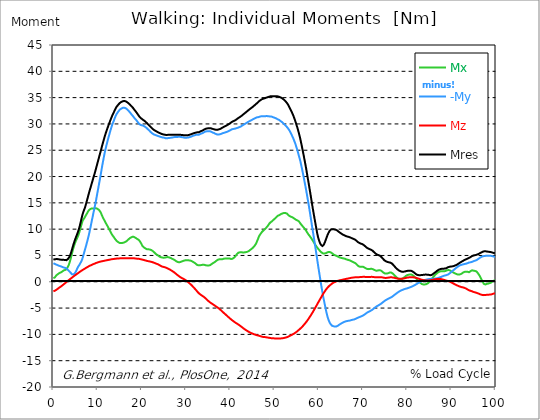
| Category |  Mx |  -My |  Mz |  Mres |
|---|---|---|---|---|
| 0.0 | 0.69 | 3.52 | -1.82 | 4.28 |
| 0.167348456675344 | 0.74 | 3.45 | -1.77 | 4.25 |
| 0.334696913350688 | 0.83 | 3.4 | -1.7 | 4.25 |
| 0.5020453700260321 | 1.01 | 3.33 | -1.62 | 4.29 |
| 0.669393826701376 | 1.22 | 3.26 | -1.53 | 4.33 |
| 0.83674228337672 | 1.31 | 3.19 | -1.44 | 4.3 |
| 1.0040907400520642 | 1.44 | 3.14 | -1.33 | 4.3 |
| 1.1621420602454444 | 1.55 | 3.08 | -1.22 | 4.29 |
| 1.3294905169207885 | 1.64 | 3.03 | -1.11 | 4.25 |
| 1.4968389735961325 | 1.71 | 2.99 | -1.01 | 4.23 |
| 1.6641874302714765 | 1.77 | 2.94 | -0.92 | 4.2 |
| 1.8315358869468206 | 1.83 | 2.88 | -0.82 | 4.17 |
| 1.9988843436221646 | 1.94 | 2.82 | -0.71 | 4.16 |
| 2.1662328002975086 | 2.04 | 2.77 | -0.61 | 4.17 |
| 2.333581256972853 | 2.15 | 2.71 | -0.49 | 4.17 |
| 2.5009297136481967 | 2.23 | 2.67 | -0.36 | 4.17 |
| 2.6682781703235405 | 2.24 | 2.64 | -0.25 | 4.13 |
| 2.8356266269988843 | 2.23 | 2.59 | -0.13 | 4.08 |
| 3.002975083674229 | 2.39 | 2.5 | -0.02 | 4.11 |
| 3.1703235403495724 | 2.66 | 2.38 | 0.09 | 4.26 |
| 3.337671997024917 | 2.92 | 2.23 | 0.22 | 4.36 |
| 3.4957233172182973 | 3.24 | 2.08 | 0.34 | 4.51 |
| 3.663071773893641 | 3.66 | 1.93 | 0.44 | 4.78 |
| 3.8304202305689854 | 4.14 | 1.8 | 0.55 | 5.12 |
| 3.997768687244329 | 4.67 | 1.63 | 0.65 | 5.55 |
| 4.165117143919673 | 5.23 | 1.43 | 0.75 | 5.99 |
| 4.332465600595017 | 5.81 | 1.39 | 0.87 | 6.5 |
| 4.499814057270361 | 6.34 | 1.39 | 0.98 | 6.97 |
| 4.667162513945706 | 6.77 | 1.49 | 1.09 | 7.39 |
| 4.834510970621049 | 7.22 | 1.59 | 1.18 | 7.83 |
| 5.001859427296393 | 7.6 | 1.82 | 1.29 | 8.23 |
| 5.169207883971737 | 7.93 | 2.08 | 1.39 | 8.6 |
| 5.336556340647081 | 8.21 | 2.39 | 1.49 | 8.95 |
| 5.503904797322425 | 8.55 | 2.69 | 1.59 | 9.33 |
| 5.671253253997769 | 8.9 | 2.95 | 1.69 | 9.73 |
| 5.82930457419115 | 9.32 | 3.15 | 1.79 | 10.19 |
| 5.996653030866494 | 9.78 | 3.38 | 1.9 | 10.71 |
| 6.164001487541838 | 10.28 | 3.64 | 2 | 11.3 |
| 6.331349944217181 | 10.8 | 3.9 | 2.1 | 11.89 |
| 6.498698400892526 | 11.3 | 4.23 | 2.18 | 12.48 |
| 6.66604685756787 | 11.68 | 4.66 | 2.27 | 12.99 |
| 6.833395314243213 | 11.9 | 5.17 | 2.36 | 13.41 |
| 7.000743770918558 | 12.1 | 5.67 | 2.44 | 13.78 |
| 7.168092227593902 | 12.28 | 6.17 | 2.52 | 14.14 |
| 7.335440684269246 | 12.6 | 6.65 | 2.61 | 14.65 |
| 7.50278914094459 | 12.85 | 7.17 | 2.69 | 15.15 |
| 7.6701375976199335 | 13.07 | 7.71 | 2.78 | 15.66 |
| 7.837486054295278 | 13.34 | 8.26 | 2.86 | 16.2 |
| 7.995537374488658 | 13.57 | 8.83 | 2.94 | 16.72 |
| 8.162885831164003 | 13.73 | 9.45 | 3.01 | 17.22 |
| 8.330234287839346 | 13.81 | 10.11 | 3.08 | 17.7 |
| 8.49758274451469 | 13.88 | 10.79 | 3.14 | 18.17 |
| 8.664931201190035 | 13.94 | 11.49 | 3.21 | 18.66 |
| 8.832279657865378 | 13.94 | 12.17 | 3.28 | 19.14 |
| 8.999628114540721 | 13.91 | 12.87 | 3.34 | 19.63 |
| 9.166976571216066 | 13.96 | 13.51 | 3.4 | 20.12 |
| 9.334325027891412 | 13.96 | 14.15 | 3.45 | 20.57 |
| 9.501673484566755 | 13.98 | 14.84 | 3.51 | 21.08 |
| 9.669021941242098 | 13.97 | 15.56 | 3.57 | 21.6 |
| 9.836370397917442 | 13.9 | 16.34 | 3.62 | 22.13 |
| 10.003718854592787 | 13.85 | 17.1 | 3.67 | 22.66 |
| 10.17106731126813 | 13.74 | 17.85 | 3.72 | 23.16 |
| 10.329118631461512 | 13.63 | 18.63 | 3.76 | 23.69 |
| 10.496467088136853 | 13.46 | 19.4 | 3.8 | 24.21 |
| 10.663815544812199 | 13.24 | 20.17 | 3.84 | 24.72 |
| 10.831164001487544 | 12.93 | 20.99 | 3.87 | 25.24 |
| 10.998512458162887 | 12.58 | 21.83 | 3.9 | 25.77 |
| 11.16586091483823 | 12.28 | 22.59 | 3.92 | 26.29 |
| 11.333209371513574 | 12 | 23.34 | 3.96 | 26.79 |
| 11.50055782818892 | 11.73 | 24.06 | 3.99 | 27.28 |
| 11.667906284864264 | 11.45 | 24.75 | 4.02 | 27.77 |
| 11.835254741539607 | 11.19 | 25.38 | 4.05 | 28.22 |
| 12.00260319821495 | 10.94 | 25.95 | 4.08 | 28.63 |
| 12.169951654890292 | 10.7 | 26.49 | 4.1 | 29.03 |
| 12.337300111565641 | 10.44 | 27.03 | 4.13 | 29.43 |
| 12.504648568240984 | 10.17 | 27.54 | 4.17 | 29.82 |
| 12.662699888434362 | 9.9 | 28.04 | 4.19 | 30.19 |
| 12.830048345109708 | 9.63 | 28.54 | 4.22 | 30.57 |
| 12.997396801785053 | 9.36 | 29.02 | 4.25 | 30.93 |
| 13.164745258460396 | 9.11 | 29.47 | 4.28 | 31.28 |
| 13.33209371513574 | 8.86 | 29.91 | 4.3 | 31.64 |
| 13.499442171811083 | 8.68 | 30.26 | 4.32 | 31.93 |
| 13.666790628486426 | 8.5 | 30.6 | 4.34 | 32.21 |
| 13.834139085161771 | 8.28 | 30.99 | 4.35 | 32.52 |
| 14.001487541837117 | 8.08 | 31.35 | 4.37 | 32.82 |
| 14.16883599851246 | 7.9 | 31.67 | 4.39 | 33.08 |
| 14.336184455187803 | 7.75 | 31.93 | 4.41 | 33.3 |
| 14.503532911863147 | 7.63 | 32.14 | 4.42 | 33.48 |
| 14.670881368538492 | 7.53 | 32.34 | 4.43 | 33.65 |
| 14.828932688731873 | 7.44 | 32.53 | 4.44 | 33.81 |
| 14.996281145407215 | 7.38 | 32.69 | 4.45 | 33.96 |
| 15.163629602082558 | 7.36 | 32.82 | 4.46 | 34.07 |
| 15.330978058757903 | 7.37 | 32.91 | 4.46 | 34.17 |
| 15.498326515433247 | 7.37 | 32.99 | 4.47 | 34.24 |
| 15.665674972108594 | 7.39 | 33.05 | 4.47 | 34.3 |
| 15.833023428783937 | 7.42 | 33.08 | 4.48 | 34.35 |
| 16.00037188545928 | 7.47 | 33.08 | 4.48 | 34.36 |
| 16.167720342134626 | 7.53 | 33.04 | 4.48 | 34.33 |
| 16.335068798809967 | 7.6 | 33 | 4.48 | 34.3 |
| 16.502417255485312 | 7.69 | 32.91 | 4.47 | 34.24 |
| 16.669765712160658 | 7.81 | 32.79 | 4.47 | 34.14 |
| 16.837114168836 | 7.94 | 32.65 | 4.48 | 34.04 |
| 17.004462625511344 | 8.07 | 32.5 | 4.48 | 33.92 |
| 17.16251394570472 | 8.19 | 32.36 | 4.48 | 33.81 |
| 17.32986240238007 | 8.32 | 32.17 | 4.48 | 33.66 |
| 17.497210859055414 | 8.4 | 31.99 | 4.48 | 33.5 |
| 17.664559315730756 | 8.47 | 31.81 | 4.48 | 33.35 |
| 17.8319077724061 | 8.55 | 31.64 | 4.47 | 33.2 |
| 17.999256229081443 | 8.58 | 31.48 | 4.47 | 33.06 |
| 18.166604685756788 | 8.53 | 31.3 | 4.46 | 32.88 |
| 18.333953142432133 | 8.48 | 31.1 | 4.45 | 32.67 |
| 18.501301599107478 | 8.38 | 30.94 | 4.43 | 32.48 |
| 18.668650055782823 | 8.3 | 30.81 | 4.41 | 32.33 |
| 18.835998512458165 | 8.21 | 30.62 | 4.4 | 32.13 |
| 19.00334696913351 | 8.11 | 30.44 | 4.38 | 31.92 |
| 19.170695425808855 | 8.03 | 30.25 | 4.37 | 31.72 |
| 19.338043882484197 | 7.94 | 30.07 | 4.36 | 31.53 |
| 19.496095202677576 | 7.77 | 29.92 | 4.33 | 31.34 |
| 19.66344365935292 | 7.55 | 29.82 | 4.3 | 31.19 |
| 19.830792116028263 | 7.32 | 29.78 | 4.27 | 31.07 |
| 19.998140572703612 | 7.03 | 29.74 | 4.23 | 30.94 |
| 20.165489029378953 | 6.77 | 29.71 | 4.21 | 30.84 |
| 20.3328374860543 | 6.62 | 29.67 | 4.17 | 30.76 |
| 20.500185942729644 | 6.52 | 29.59 | 4.13 | 30.65 |
| 20.667534399404985 | 6.42 | 29.5 | 4.08 | 30.54 |
| 20.83488285608033 | 6.32 | 29.39 | 4.04 | 30.41 |
| 21.002231312755672 | 6.23 | 29.29 | 4.01 | 30.28 |
| 21.16957976943102 | 6.17 | 29.17 | 3.96 | 30.15 |
| 21.336928226106362 | 6.16 | 29.02 | 3.93 | 30.01 |
| 21.504276682781704 | 6.17 | 28.87 | 3.91 | 29.86 |
| 21.67162513945705 | 6.14 | 28.76 | 3.89 | 29.74 |
| 21.82967645965043 | 6.12 | 28.6 | 3.86 | 29.58 |
| 21.997024916325774 | 6.08 | 28.46 | 3.81 | 29.43 |
| 22.16437337300112 | 6.02 | 28.32 | 3.77 | 29.28 |
| 22.33172182967646 | 5.95 | 28.22 | 3.74 | 29.16 |
| 22.499070286351806 | 5.82 | 28.11 | 3.7 | 29.02 |
| 22.666418743027148 | 5.7 | 28.03 | 3.65 | 28.92 |
| 22.833767199702496 | 5.57 | 27.95 | 3.59 | 28.81 |
| 23.00111565637784 | 5.41 | 27.91 | 3.53 | 28.73 |
| 23.168464113053183 | 5.28 | 27.87 | 3.47 | 28.65 |
| 23.335812569728528 | 5.2 | 27.81 | 3.42 | 28.58 |
| 23.50316102640387 | 5.1 | 27.75 | 3.38 | 28.49 |
| 23.670509483079215 | 5 | 27.7 | 3.32 | 28.42 |
| 23.83785793975456 | 4.89 | 27.65 | 3.25 | 28.34 |
| 23.995909259947936 | 4.79 | 27.61 | 3.16 | 28.28 |
| 24.163257716623285 | 4.71 | 27.57 | 3.07 | 28.22 |
| 24.330606173298627 | 4.67 | 27.51 | 2.99 | 28.14 |
| 24.49795462997397 | 4.63 | 27.46 | 2.92 | 28.09 |
| 24.665303086649313 | 4.59 | 27.43 | 2.87 | 28.04 |
| 24.83265154332466 | 4.57 | 27.4 | 2.85 | 28.01 |
| 25.0 | 4.56 | 27.39 | 2.81 | 27.99 |
| 25.167348456675345 | 4.59 | 27.35 | 2.76 | 27.95 |
| 25.334696913350694 | 4.62 | 27.29 | 2.72 | 27.91 |
| 25.502045370026035 | 4.65 | 27.28 | 2.67 | 27.9 |
| 25.669393826701377 | 4.69 | 27.28 | 2.61 | 27.9 |
| 25.836742283376722 | 4.7 | 27.3 | 2.54 | 27.92 |
| 26.004090740052067 | 4.68 | 27.31 | 2.46 | 27.91 |
| 26.17143919672741 | 4.63 | 27.34 | 2.39 | 27.93 |
| 26.329490516920792 | 4.58 | 27.35 | 2.32 | 27.92 |
| 26.49683897359613 | 4.53 | 27.37 | 2.24 | 27.93 |
| 26.66418743027148 | 4.46 | 27.39 | 2.15 | 27.94 |
| 26.831535886946828 | 4.38 | 27.42 | 2.06 | 27.95 |
| 26.998884343622166 | 4.31 | 27.44 | 1.97 | 27.95 |
| 27.166232800297514 | 4.25 | 27.46 | 1.88 | 27.96 |
| 27.333581256972852 | 4.16 | 27.49 | 1.78 | 27.96 |
| 27.5009297136482 | 4.08 | 27.51 | 1.67 | 27.96 |
| 27.668278170323543 | 3.97 | 27.5 | 1.55 | 27.94 |
| 27.835626626998888 | 3.87 | 27.5 | 1.43 | 27.93 |
| 28.002975083674233 | 3.8 | 27.51 | 1.32 | 27.93 |
| 28.170323540349575 | 3.75 | 27.54 | 1.21 | 27.95 |
| 28.33767199702492 | 3.71 | 27.56 | 1.1 | 27.96 |
| 28.50502045370026 | 3.7 | 27.56 | 1 | 27.95 |
| 28.663071773893645 | 3.73 | 27.55 | 0.9 | 27.94 |
| 28.830420230568986 | 3.79 | 27.52 | 0.81 | 27.92 |
| 28.99776868724433 | 3.85 | 27.49 | 0.73 | 27.91 |
| 29.165117143919673 | 3.91 | 27.47 | 0.66 | 27.89 |
| 29.33246560059502 | 3.96 | 27.44 | 0.59 | 27.87 |
| 29.499814057270367 | 4.01 | 27.41 | 0.51 | 27.85 |
| 29.66716251394571 | 4.05 | 27.39 | 0.43 | 27.84 |
| 29.834510970621054 | 4.08 | 27.38 | 0.35 | 27.83 |
| 30.00185942729639 | 4.1 | 27.37 | 0.25 | 27.82 |
| 30.169207883971744 | 4.09 | 27.38 | 0.15 | 27.83 |
| 30.33655634064708 | 4.08 | 27.4 | 0.04 | 27.85 |
| 30.50390479732243 | 4.07 | 27.42 | -0.09 | 27.87 |
| 30.671253253997772 | 4.08 | 27.45 | -0.21 | 27.91 |
| 30.829304574191156 | 4.06 | 27.49 | -0.33 | 27.96 |
| 30.996653030866494 | 4.04 | 27.54 | -0.45 | 28.01 |
| 31.164001487541842 | 3.97 | 27.58 | -0.59 | 28.05 |
| 31.331349944217187 | 3.9 | 27.65 | -0.72 | 28.1 |
| 31.498698400892525 | 3.82 | 27.71 | -0.87 | 28.16 |
| 31.666046857567874 | 3.74 | 27.77 | -1.02 | 28.21 |
| 31.833395314243212 | 3.65 | 27.82 | -1.17 | 28.26 |
| 32.00074377091856 | 3.56 | 27.85 | -1.33 | 28.28 |
| 32.1680922275939 | 3.46 | 27.9 | -1.49 | 28.33 |
| 32.33544068426925 | 3.3 | 27.95 | -1.65 | 28.39 |
| 32.50278914094459 | 3.2 | 27.95 | -1.82 | 28.4 |
| 32.670137597619934 | 3.16 | 27.93 | -1.99 | 28.4 |
| 32.83748605429528 | 3.13 | 27.93 | -2.13 | 28.4 |
| 33.004834510970625 | 3.14 | 27.98 | -2.26 | 28.46 |
| 33.162885831164004 | 3.14 | 28.07 | -2.37 | 28.55 |
| 33.33023428783935 | 3.17 | 28.14 | -2.48 | 28.62 |
| 33.497582744514695 | 3.19 | 28.18 | -2.58 | 28.67 |
| 33.664931201190036 | 3.22 | 28.23 | -2.67 | 28.73 |
| 33.83227965786538 | 3.25 | 28.29 | -2.77 | 28.79 |
| 33.99962811454073 | 3.25 | 28.38 | -2.86 | 28.88 |
| 34.16697657121607 | 3.21 | 28.47 | -2.97 | 28.97 |
| 34.33432502789141 | 3.16 | 28.54 | -3.09 | 29.04 |
| 34.50167348456676 | 3.12 | 28.59 | -3.21 | 29.09 |
| 34.6690219412421 | 3.1 | 28.6 | -3.36 | 29.13 |
| 34.83637039791744 | 3.11 | 28.61 | -3.49 | 29.15 |
| 35.00371885459279 | 3.1 | 28.62 | -3.62 | 29.18 |
| 35.17106731126814 | 3.1 | 28.62 | -3.74 | 29.19 |
| 35.338415767943474 | 3.12 | 28.63 | -3.86 | 29.22 |
| 35.49646708813686 | 3.18 | 28.59 | -3.97 | 29.2 |
| 35.6638155448122 | 3.28 | 28.52 | -4.06 | 29.15 |
| 35.831164001487544 | 3.4 | 28.45 | -4.15 | 29.1 |
| 35.998512458162885 | 3.52 | 28.37 | -4.24 | 29.04 |
| 36.165860914838234 | 3.58 | 28.32 | -4.33 | 29.02 |
| 36.333209371513576 | 3.64 | 28.27 | -4.43 | 28.99 |
| 36.50055782818892 | 3.75 | 28.18 | -4.52 | 28.93 |
| 36.667906284864266 | 3.85 | 28.11 | -4.63 | 28.9 |
| 36.83525474153961 | 3.97 | 28.06 | -4.73 | 28.89 |
| 37.002603198214956 | 4.09 | 28.01 | -4.81 | 28.89 |
| 37.1699516548903 | 4.18 | 27.99 | -4.9 | 28.91 |
| 37.337300111565646 | 4.24 | 27.98 | -5.01 | 28.93 |
| 37.50464856824098 | 4.26 | 28 | -5.13 | 28.98 |
| 37.66269988843437 | 4.25 | 28.03 | -5.25 | 29.03 |
| 37.83004834510971 | 4.27 | 28.07 | -5.37 | 29.09 |
| 37.99739680178505 | 4.26 | 28.13 | -5.49 | 29.17 |
| 38.16474525846039 | 4.27 | 28.2 | -5.62 | 29.27 |
| 38.33209371513574 | 4.32 | 28.25 | -5.76 | 29.35 |
| 38.49944217181109 | 4.38 | 28.28 | -5.89 | 29.42 |
| 38.666790628486424 | 4.41 | 28.33 | -6.02 | 29.5 |
| 38.83413908516178 | 4.41 | 28.39 | -6.14 | 29.58 |
| 39.001487541837115 | 4.42 | 28.43 | -6.26 | 29.65 |
| 39.16883599851246 | 4.44 | 28.46 | -6.4 | 29.71 |
| 39.336184455187805 | 4.45 | 28.52 | -6.53 | 29.79 |
| 39.503532911863154 | 4.44 | 28.59 | -6.65 | 29.88 |
| 39.670881368538495 | 4.43 | 28.65 | -6.77 | 29.97 |
| 39.83822982521384 | 4.43 | 28.7 | -6.9 | 30.05 |
| 39.996281145407224 | 4.38 | 28.8 | -7.02 | 30.15 |
| 40.163629602082565 | 4.33 | 28.89 | -7.14 | 30.26 |
| 40.33097805875791 | 4.33 | 28.97 | -7.25 | 30.36 |
| 40.498326515433256 | 4.37 | 29.02 | -7.36 | 30.45 |
| 40.6656749721086 | 4.47 | 29.04 | -7.47 | 30.51 |
| 40.83302342878393 | 4.57 | 29.07 | -7.56 | 30.58 |
| 41.00037188545929 | 4.71 | 29.09 | -7.67 | 30.64 |
| 41.16772034213463 | 4.86 | 29.12 | -7.77 | 30.71 |
| 41.33506879880997 | 5.05 | 29.17 | -7.86 | 30.82 |
| 41.50241725548531 | 5.25 | 29.21 | -7.94 | 30.92 |
| 41.66976571216066 | 5.41 | 29.26 | -8.03 | 31.02 |
| 41.837114168836 | 5.52 | 29.31 | -8.13 | 31.13 |
| 42.004462625511344 | 5.57 | 29.37 | -8.22 | 31.22 |
| 42.17181108218669 | 5.6 | 29.43 | -8.32 | 31.31 |
| 42.32986240238007 | 5.63 | 29.49 | -8.43 | 31.4 |
| 42.497210859055414 | 5.63 | 29.56 | -8.54 | 31.5 |
| 42.66455931573076 | 5.6 | 29.67 | -8.64 | 31.62 |
| 42.831907772406105 | 5.57 | 29.77 | -8.75 | 31.74 |
| 42.999256229081446 | 5.57 | 29.85 | -8.86 | 31.86 |
| 43.16660468575679 | 5.58 | 29.92 | -8.96 | 31.96 |
| 43.33395314243214 | 5.59 | 30.01 | -9.07 | 32.07 |
| 43.50130159910748 | 5.63 | 30.09 | -9.16 | 32.19 |
| 43.66865005578282 | 5.66 | 30.19 | -9.25 | 32.31 |
| 43.83599851245817 | 5.69 | 30.27 | -9.34 | 32.42 |
| 44.00334696913351 | 5.74 | 30.36 | -9.42 | 32.53 |
| 44.17069542580886 | 5.83 | 30.44 | -9.5 | 32.65 |
| 44.3380438824842 | 5.93 | 30.52 | -9.59 | 32.76 |
| 44.49609520267758 | 6.05 | 30.6 | -9.66 | 32.88 |
| 44.66344365935292 | 6.15 | 30.67 | -9.72 | 32.97 |
| 44.83079211602827 | 6.26 | 30.74 | -9.78 | 33.08 |
| 44.99814057270361 | 6.38 | 30.82 | -9.84 | 33.19 |
| 45.16548902937895 | 6.51 | 30.9 | -9.9 | 33.3 |
| 45.332837486054295 | 6.65 | 30.98 | -9.96 | 33.43 |
| 45.500185942729644 | 6.83 | 31.05 | -10.02 | 33.54 |
| 45.66753439940499 | 7.02 | 31.12 | -10.06 | 33.66 |
| 45.83488285608033 | 7.26 | 31.2 | -10.1 | 33.79 |
| 46.00223131275568 | 7.59 | 31.24 | -10.15 | 33.91 |
| 46.16957976943102 | 7.93 | 31.26 | -10.18 | 34.03 |
| 46.336928226106366 | 8.28 | 31.29 | -10.22 | 34.16 |
| 46.50427668278171 | 8.64 | 31.34 | -10.26 | 34.31 |
| 46.671625139457056 | 8.87 | 31.38 | -10.31 | 34.42 |
| 46.829676459650436 | 9.08 | 31.42 | -10.35 | 34.52 |
| 46.99702491632577 | 9.28 | 31.45 | -10.39 | 34.62 |
| 47.16437337300112 | 9.48 | 31.46 | -10.44 | 34.7 |
| 47.33172182967646 | 9.67 | 31.45 | -10.47 | 34.75 |
| 47.49907028635181 | 9.76 | 31.47 | -10.49 | 34.8 |
| 47.66641874302716 | 9.87 | 31.47 | -10.5 | 34.84 |
| 47.83376719970249 | 10 | 31.47 | -10.51 | 34.89 |
| 48.001115656377834 | 10.15 | 31.48 | -10.53 | 34.95 |
| 48.16846411305319 | 10.31 | 31.49 | -10.56 | 35 |
| 48.33581256972853 | 10.46 | 31.49 | -10.59 | 35.05 |
| 48.50316102640387 | 10.64 | 31.48 | -10.61 | 35.09 |
| 48.67050948307921 | 10.85 | 31.45 | -10.63 | 35.14 |
| 48.837857939754564 | 11.07 | 31.43 | -10.65 | 35.19 |
| 49.005206396429905 | 11.26 | 31.42 | -10.68 | 35.25 |
| 49.163257716623285 | 11.34 | 31.41 | -10.7 | 35.27 |
| 49.33060617329863 | 11.42 | 31.39 | -10.73 | 35.28 |
| 49.49795462997397 | 11.54 | 31.34 | -10.74 | 35.27 |
| 49.66530308664932 | 11.68 | 31.28 | -10.75 | 35.27 |
| 49.832651543324666 | 11.82 | 31.24 | -10.76 | 35.28 |
| 50.0 | 11.95 | 31.18 | -10.76 | 35.28 |
| 50.16734845667534 | 12.07 | 31.13 | -10.77 | 35.27 |
| 50.33469691335069 | 12.21 | 31.07 | -10.78 | 35.27 |
| 50.50204537002604 | 12.36 | 30.99 | -10.77 | 35.26 |
| 50.66939382670139 | 12.48 | 30.9 | -10.76 | 35.23 |
| 50.836742283376715 | 12.59 | 30.84 | -10.76 | 35.22 |
| 51.00409074005207 | 12.64 | 30.78 | -10.77 | 35.18 |
| 51.17143919672741 | 12.7 | 30.68 | -10.77 | 35.11 |
| 51.32949051692079 | 12.78 | 30.57 | -10.77 | 35.04 |
| 51.496838973596134 | 12.89 | 30.48 | -10.77 | 34.99 |
| 51.66418743027148 | 12.95 | 30.37 | -10.75 | 34.91 |
| 51.831535886946824 | 12.99 | 30.24 | -10.73 | 34.81 |
| 51.99888434362217 | 13.04 | 30.11 | -10.71 | 34.7 |
| 52.16623280029752 | 13.09 | 29.98 | -10.68 | 34.59 |
| 52.33358125697285 | 13.1 | 29.84 | -10.65 | 34.46 |
| 52.5009297136482 | 13.06 | 29.69 | -10.61 | 34.3 |
| 52.668278170323546 | 13.02 | 29.54 | -10.57 | 34.14 |
| 52.835626626998895 | 12.95 | 29.38 | -10.52 | 33.96 |
| 53.00297508367424 | 12.79 | 29.23 | -10.47 | 33.75 |
| 53.17032354034958 | 12.64 | 29.04 | -10.41 | 33.51 |
| 53.33767199702492 | 12.49 | 28.82 | -10.34 | 33.23 |
| 53.50502045370027 | 12.44 | 28.56 | -10.27 | 32.96 |
| 53.663071773893655 | 12.39 | 28.29 | -10.2 | 32.68 |
| 53.83042023056899 | 12.33 | 28 | -10.13 | 32.39 |
| 53.99776868724433 | 12.26 | 27.7 | -10.05 | 32.07 |
| 54.16511714391967 | 12.19 | 27.41 | -9.98 | 31.77 |
| 54.33246560059503 | 12.11 | 27.07 | -9.89 | 31.41 |
| 54.49981405727037 | 12 | 26.7 | -9.8 | 31.02 |
| 54.667162513945705 | 11.88 | 26.34 | -9.72 | 30.63 |
| 54.834510970621054 | 11.79 | 25.91 | -9.62 | 30.2 |
| 55.0018594272964 | 11.73 | 25.46 | -9.51 | 29.75 |
| 55.169207883971744 | 11.67 | 25.01 | -9.4 | 29.3 |
| 55.336556340647086 | 11.6 | 24.51 | -9.27 | 28.81 |
| 55.50390479732243 | 11.5 | 23.98 | -9.15 | 28.28 |
| 55.671253253997776 | 11.32 | 23.49 | -9.03 | 27.73 |
| 55.83860171067312 | 11.1 | 22.97 | -8.9 | 27.15 |
| 55.9966530308665 | 10.92 | 22.33 | -8.77 | 26.5 |
| 56.16400148754184 | 10.75 | 21.68 | -8.63 | 25.83 |
| 56.33134994421718 | 10.57 | 21 | -8.49 | 25.13 |
| 56.498698400892536 | 10.41 | 20.31 | -8.34 | 24.44 |
| 56.66604685756788 | 10.25 | 19.59 | -8.17 | 23.72 |
| 56.83339531424321 | 10.09 | 18.86 | -8 | 22.98 |
| 57.00074377091856 | 9.89 | 18.12 | -7.83 | 22.23 |
| 57.16809222759391 | 9.68 | 17.38 | -7.65 | 21.47 |
| 57.33544068426925 | 9.45 | 16.58 | -7.47 | 20.64 |
| 57.5027891409446 | 9.22 | 15.77 | -7.28 | 19.81 |
| 57.670137597619934 | 9.01 | 14.95 | -7.08 | 18.99 |
| 57.83748605429528 | 8.83 | 14.11 | -6.86 | 18.17 |
| 58.004834510970625 | 8.65 | 13.23 | -6.65 | 17.33 |
| 58.16288583116401 | 8.47 | 12.33 | -6.44 | 16.48 |
| 58.330234287839346 | 8.25 | 11.43 | -6.21 | 15.61 |
| 58.497582744514695 | 8.03 | 10.51 | -5.98 | 14.73 |
| 58.66493120119004 | 7.81 | 9.61 | -5.75 | 13.88 |
| 58.832279657865385 | 7.58 | 8.76 | -5.51 | 13.08 |
| 58.999628114540734 | 7.34 | 7.87 | -5.27 | 12.28 |
| 59.16697657121607 | 7.11 | 6.96 | -5.02 | 11.48 |
| 59.33432502789142 | 6.89 | 6.03 | -4.77 | 10.7 |
| 59.50167348456676 | 6.69 | 5.09 | -4.52 | 9.92 |
| 59.66902194124211 | 6.49 | 4.16 | -4.27 | 9.18 |
| 59.83637039791745 | 6.3 | 3.23 | -4.01 | 8.53 |
| 60.00371885459278 | 6.14 | 2.32 | -3.76 | 8.06 |
| 60.17106731126813 | 5.97 | 1.44 | -3.52 | 7.63 |
| 60.33841576794349 | 5.82 | 0.56 | -3.27 | 7.3 |
| 60.49646708813685 | 5.67 | -0.32 | -3.02 | 7.03 |
| 60.6638155448122 | 5.55 | -1.15 | -2.78 | 6.85 |
| 60.831164001487544 | 5.46 | -1.98 | -2.54 | 6.8 |
| 60.99851245816289 | 5.39 | -2.78 | -2.29 | 6.82 |
| 61.16586091483824 | 5.37 | -3.47 | -2.08 | 7.07 |
| 61.333209371513576 | 5.38 | -4.17 | -1.87 | 7.4 |
| 61.50055782818892 | 5.41 | -4.85 | -1.67 | 7.75 |
| 61.667906284864266 | 5.45 | -5.52 | -1.46 | 8.14 |
| 61.835254741539615 | 5.53 | -6.12 | -1.28 | 8.53 |
| 62.002603198214956 | 5.62 | -6.67 | -1.11 | 8.92 |
| 62.16995165489029 | 5.65 | -7.12 | -0.95 | 9.22 |
| 62.33730011156564 | 5.66 | -7.48 | -0.82 | 9.49 |
| 62.504648568240995 | 5.66 | -7.79 | -0.7 | 9.72 |
| 62.67199702491633 | 5.61 | -8.02 | -0.58 | 9.87 |
| 62.83004834510971 | 5.54 | -8.2 | -0.47 | 9.97 |
| 62.99739680178505 | 5.43 | -8.35 | -0.36 | 10.02 |
| 63.1647452584604 | 5.31 | -8.41 | -0.26 | 10 |
| 63.33209371513575 | 5.19 | -8.46 | -0.17 | 9.97 |
| 63.4994421718111 | 5.1 | -8.49 | -0.1 | 9.95 |
| 63.666790628486424 | 5.04 | -8.51 | -0.04 | 9.93 |
| 63.83413908516177 | 4.98 | -8.5 | 0.02 | 9.9 |
| 64.00148754183712 | 4.94 | -8.49 | 0.08 | 9.86 |
| 64.16883599851248 | 4.85 | -8.43 | 0.14 | 9.76 |
| 64.3361844551878 | 4.79 | -8.35 | 0.18 | 9.66 |
| 64.50353291186315 | 4.68 | -8.25 | 0.22 | 9.52 |
| 64.6708813685385 | 4.64 | -8.15 | 0.26 | 9.41 |
| 64.83822982521384 | 4.59 | -8.06 | 0.3 | 9.31 |
| 65.00557828188919 | 4.56 | -7.97 | 0.32 | 9.22 |
| 65.16362960208257 | 4.52 | -7.89 | 0.35 | 9.12 |
| 65.3309780587579 | 4.48 | -7.81 | 0.38 | 9.03 |
| 65.49832651543326 | 4.44 | -7.72 | 0.42 | 8.94 |
| 65.6656749721086 | 4.43 | -7.67 | 0.45 | 8.88 |
| 65.83302342878395 | 4.4 | -7.61 | 0.48 | 8.82 |
| 66.00037188545929 | 4.35 | -7.55 | 0.51 | 8.74 |
| 66.16772034213463 | 4.28 | -7.5 | 0.54 | 8.67 |
| 66.33506879880998 | 4.23 | -7.47 | 0.57 | 8.62 |
| 66.50241725548531 | 4.19 | -7.45 | 0.59 | 8.59 |
| 66.66976571216065 | 4.15 | -7.42 | 0.62 | 8.55 |
| 66.83711416883601 | 4.11 | -7.41 | 0.65 | 8.52 |
| 67.00446262551135 | 4.07 | -7.38 | 0.69 | 8.48 |
| 67.1718110821867 | 4.01 | -7.34 | 0.72 | 8.41 |
| 67.32986240238007 | 3.94 | -7.29 | 0.75 | 8.34 |
| 67.49721085905541 | 3.87 | -7.25 | 0.78 | 8.27 |
| 67.66455931573076 | 3.78 | -7.22 | 0.79 | 8.21 |
| 67.83190777240611 | 3.71 | -7.19 | 0.81 | 8.16 |
| 67.99925622908145 | 3.65 | -7.16 | 0.83 | 8.11 |
| 68.16660468575678 | 3.59 | -7.1 | 0.84 | 8.03 |
| 68.33395314243214 | 3.51 | -7.04 | 0.85 | 7.95 |
| 68.50130159910749 | 3.37 | -6.97 | 0.86 | 7.82 |
| 68.66865005578282 | 3.22 | -6.9 | 0.86 | 7.69 |
| 68.83599851245816 | 3.08 | -6.83 | 0.86 | 7.56 |
| 69.00334696913352 | 2.97 | -6.78 | 0.87 | 7.47 |
| 69.17069542580886 | 2.9 | -6.72 | 0.88 | 7.39 |
| 69.3380438824842 | 2.85 | -6.67 | 0.89 | 7.33 |
| 69.50539233915956 | 2.82 | -6.61 | 0.9 | 7.26 |
| 69.66344365935292 | 2.83 | -6.55 | 0.91 | 7.21 |
| 69.83079211602826 | 2.86 | -6.49 | 0.93 | 7.16 |
| 69.99814057270362 | 2.85 | -6.42 | 0.94 | 7.09 |
| 70.16548902937896 | 2.8 | -6.34 | 0.95 | 7 |
| 70.33283748605429 | 2.72 | -6.24 | 0.94 | 6.88 |
| 70.50018594272964 | 2.63 | -6.13 | 0.93 | 6.75 |
| 70.667534399405 | 2.54 | -6.03 | 0.91 | 6.62 |
| 70.83488285608033 | 2.47 | -5.93 | 0.9 | 6.5 |
| 71.00223131275568 | 2.42 | -5.84 | 0.89 | 6.41 |
| 71.16957976943102 | 2.4 | -5.76 | 0.89 | 6.33 |
| 71.33692822610637 | 2.4 | -5.69 | 0.9 | 6.26 |
| 71.50427668278171 | 2.42 | -5.62 | 0.91 | 6.2 |
| 71.67162513945706 | 2.45 | -5.54 | 0.92 | 6.15 |
| 71.8389735961324 | 2.47 | -5.47 | 0.93 | 6.09 |
| 71.99702491632577 | 2.46 | -5.38 | 0.94 | 6.01 |
| 72.16437337300113 | 2.43 | -5.29 | 0.93 | 5.91 |
| 72.33172182967647 | 2.36 | -5.17 | 0.91 | 5.78 |
| 72.49907028635181 | 2.28 | -5.05 | 0.89 | 5.64 |
| 72.66641874302715 | 2.22 | -4.94 | 0.87 | 5.5 |
| 72.8337671997025 | 2.15 | -4.82 | 0.85 | 5.37 |
| 73.00111565637783 | 2.1 | -4.72 | 0.84 | 5.25 |
| 73.16846411305319 | 2.11 | -4.64 | 0.85 | 5.18 |
| 73.33581256972853 | 2.13 | -4.56 | 0.86 | 5.13 |
| 73.50316102640387 | 2.16 | -4.48 | 0.87 | 5.07 |
| 73.67050948307921 | 2.2 | -4.4 | 0.88 | 5.01 |
| 73.83785793975457 | 2.21 | -4.32 | 0.89 | 4.95 |
| 74.00520639642991 | 2.16 | -4.23 | 0.88 | 4.84 |
| 74.16325771662328 | 2.07 | -4.12 | 0.86 | 4.71 |
| 74.33060617329863 | 1.96 | -4.01 | 0.84 | 4.55 |
| 74.49795462997398 | 1.85 | -3.89 | 0.81 | 4.4 |
| 74.66530308664932 | 1.72 | -3.78 | 0.78 | 4.24 |
| 74.83265154332466 | 1.61 | -3.67 | 0.75 | 4.09 |
| 75.00000000000001 | 1.56 | -3.57 | 0.73 | 3.98 |
| 75.16734845667534 | 1.54 | -3.49 | 0.73 | 3.9 |
| 75.3346969133507 | 1.56 | -3.41 | 0.74 | 3.84 |
| 75.50204537002605 | 1.59 | -3.33 | 0.75 | 3.78 |
| 75.66939382670138 | 1.61 | -3.25 | 0.77 | 3.73 |
| 75.83674228337672 | 1.66 | -3.18 | 0.8 | 3.7 |
| 76.00409074005208 | 1.74 | -3.11 | 0.83 | 3.69 |
| 76.17143919672742 | 1.78 | -3.04 | 0.85 | 3.65 |
| 76.33878765340276 | 1.77 | -2.97 | 0.85 | 3.59 |
| 76.49683897359614 | 1.71 | -2.9 | 0.84 | 3.51 |
| 76.66418743027148 | 1.61 | -2.81 | 0.83 | 3.38 |
| 76.83153588694682 | 1.5 | -2.69 | 0.81 | 3.23 |
| 76.99888434362218 | 1.35 | -2.58 | 0.78 | 3.06 |
| 77.16623280029752 | 1.2 | -2.48 | 0.74 | 2.91 |
| 77.33358125697285 | 1.04 | -2.37 | 0.7 | 2.74 |
| 77.5009297136482 | 0.91 | -2.26 | 0.67 | 2.59 |
| 77.66827817032356 | 0.8 | -2.16 | 0.64 | 2.47 |
| 77.83562662699889 | 0.69 | -2.05 | 0.61 | 2.34 |
| 78.00297508367423 | 0.58 | -1.95 | 0.58 | 2.21 |
| 78.17032354034959 | 0.52 | -1.86 | 0.56 | 2.12 |
| 78.33767199702493 | 0.53 | -1.78 | 0.56 | 2.06 |
| 78.50502045370027 | 0.53 | -1.71 | 0.56 | 2 |
| 78.67236891037561 | 0.54 | -1.64 | 0.56 | 1.94 |
| 78.83042023056899 | 0.57 | -1.58 | 0.57 | 1.9 |
| 78.99776868724433 | 0.64 | -1.52 | 0.59 | 1.89 |
| 79.16511714391969 | 0.73 | -1.46 | 0.62 | 1.91 |
| 79.33246560059503 | 0.83 | -1.41 | 0.65 | 1.93 |
| 79.49981405727036 | 0.96 | -1.36 | 0.68 | 1.96 |
| 79.66716251394571 | 1.09 | -1.32 | 0.72 | 2 |
| 79.83451097062107 | 1.18 | -1.29 | 0.75 | 2.04 |
| 80.00185942729641 | 1.26 | -1.25 | 0.79 | 2.08 |
| 80.16920788397174 | 1.31 | -1.2 | 0.81 | 2.09 |
| 80.33655634064709 | 1.34 | -1.15 | 0.83 | 2.1 |
| 80.50390479732243 | 1.37 | -1.11 | 0.85 | 2.11 |
| 80.67125325399778 | 1.38 | -1.05 | 0.86 | 2.1 |
| 80.83860171067312 | 1.39 | -1.01 | 0.87 | 2.1 |
| 80.99665303086651 | 1.36 | -0.94 | 0.87 | 2.06 |
| 81.16400148754184 | 1.3 | -0.88 | 0.86 | 1.99 |
| 81.3313499442172 | 1.19 | -0.81 | 0.85 | 1.9 |
| 81.49869840089255 | 1.08 | -0.74 | 0.83 | 1.79 |
| 81.66604685756786 | 0.95 | -0.66 | 0.81 | 1.68 |
| 81.83339531424322 | 0.82 | -0.59 | 0.78 | 1.56 |
| 82.00074377091858 | 0.66 | -0.5 | 0.75 | 1.43 |
| 82.16809222759392 | 0.51 | -0.41 | 0.71 | 1.35 |
| 82.33544068426926 | 0.35 | -0.32 | 0.66 | 1.31 |
| 82.50278914094459 | 0.19 | -0.24 | 0.62 | 1.27 |
| 82.67013759761994 | 0.04 | -0.15 | 0.57 | 1.25 |
| 82.83748605429528 | -0.1 | -0.07 | 0.53 | 1.24 |
| 83.00483451097062 | -0.23 | 0 | 0.47 | 1.25 |
| 83.17218296764597 | -0.37 | 0.08 | 0.42 | 1.27 |
| 83.33023428783935 | -0.44 | 0.14 | 0.38 | 1.28 |
| 83.4975827445147 | -0.49 | 0.19 | 0.35 | 1.3 |
| 83.66493120119004 | -0.51 | 0.24 | 0.31 | 1.32 |
| 83.83227965786537 | -0.52 | 0.29 | 0.29 | 1.34 |
| 83.99962811454073 | -0.51 | 0.33 | 0.27 | 1.36 |
| 84.16697657121607 | -0.49 | 0.36 | 0.26 | 1.37 |
| 84.33432502789142 | -0.45 | 0.4 | 0.25 | 1.37 |
| 84.50167348456677 | -0.39 | 0.44 | 0.25 | 1.35 |
| 84.6690219412421 | -0.29 | 0.48 | 0.25 | 1.33 |
| 84.83637039791745 | -0.18 | 0.51 | 0.25 | 1.32 |
| 85.0037188545928 | -0.03 | 0.52 | 0.26 | 1.28 |
| 85.17106731126813 | 0.13 | 0.54 | 0.28 | 1.25 |
| 85.33841576794349 | 0.31 | 0.55 | 0.3 | 1.26 |
| 85.50576422461883 | 0.47 | 0.56 | 0.33 | 1.28 |
| 85.66381554481221 | 0.65 | 0.57 | 0.35 | 1.37 |
| 85.83116400148755 | 0.84 | 0.58 | 0.39 | 1.47 |
| 85.99851245816289 | 1.01 | 0.58 | 0.42 | 1.57 |
| 86.16586091483823 | 1.18 | 0.59 | 0.45 | 1.68 |
| 86.33320937151358 | 1.31 | 0.61 | 0.48 | 1.78 |
| 86.50055782818893 | 1.44 | 0.63 | 0.5 | 1.89 |
| 86.66790628486427 | 1.58 | 0.65 | 0.52 | 2.02 |
| 86.83525474153961 | 1.71 | 0.68 | 0.54 | 2.13 |
| 87.00260319821496 | 1.8 | 0.72 | 0.54 | 2.22 |
| 87.16995165489031 | 1.88 | 0.77 | 0.54 | 2.3 |
| 87.33730011156564 | 1.94 | 0.82 | 0.54 | 2.36 |
| 87.504648568241 | 1.98 | 0.87 | 0.53 | 2.41 |
| 87.67199702491634 | 2.01 | 0.92 | 0.51 | 2.45 |
| 87.83004834510972 | 2.01 | 0.99 | 0.48 | 2.47 |
| 87.99739680178506 | 2 | 1.04 | 0.44 | 2.48 |
| 88.1647452584604 | 1.98 | 1.1 | 0.41 | 2.48 |
| 88.33209371513574 | 1.99 | 1.15 | 0.36 | 2.5 |
| 88.49944217181108 | 2.03 | 1.18 | 0.32 | 2.51 |
| 88.66679062848644 | 2.05 | 1.22 | 0.27 | 2.52 |
| 88.83413908516178 | 2.1 | 1.27 | 0.23 | 2.57 |
| 89.00148754183712 | 2.18 | 1.3 | 0.19 | 2.66 |
| 89.16883599851246 | 2.21 | 1.36 | 0.15 | 2.73 |
| 89.33618445518782 | 2.23 | 1.43 | 0.11 | 2.79 |
| 89.50353291186315 | 2.21 | 1.53 | 0.07 | 2.84 |
| 89.6708813685385 | 2.15 | 1.64 | 0.02 | 2.87 |
| 89.83822982521386 | 2.07 | 1.75 | -0.05 | 2.89 |
| 90.00557828188919 | 1.99 | 1.87 | -0.12 | 2.91 |
| 90.16362960208257 | 1.89 | 1.98 | -0.2 | 2.92 |
| 90.3309780587579 | 1.81 | 2.11 | -0.28 | 2.94 |
| 90.49832651543326 | 1.73 | 2.23 | -0.36 | 2.98 |
| 90.66567497210859 | 1.66 | 2.35 | -0.43 | 3.02 |
| 90.83302342878395 | 1.59 | 2.48 | -0.5 | 3.09 |
| 91.00037188545929 | 1.52 | 2.59 | -0.57 | 3.15 |
| 91.16772034213463 | 1.46 | 2.7 | -0.64 | 3.21 |
| 91.33506879880998 | 1.41 | 2.8 | -0.71 | 3.29 |
| 91.50241725548533 | 1.38 | 2.9 | -0.77 | 3.38 |
| 91.66976571216065 | 1.36 | 3 | -0.83 | 3.48 |
| 91.83711416883601 | 1.38 | 3.09 | -0.89 | 3.58 |
| 92.00446262551137 | 1.42 | 3.15 | -0.94 | 3.67 |
| 92.1718110821867 | 1.48 | 3.19 | -0.99 | 3.75 |
| 92.33915953886203 | 1.55 | 3.24 | -1.02 | 3.83 |
| 92.49721085905541 | 1.66 | 3.28 | -1.05 | 3.92 |
| 92.66455931573077 | 1.77 | 3.31 | -1.08 | 4.01 |
| 92.83190777240611 | 1.84 | 3.34 | -1.12 | 4.08 |
| 92.99925622908145 | 1.88 | 3.38 | -1.17 | 4.16 |
| 93.1666046857568 | 1.91 | 3.41 | -1.24 | 4.22 |
| 93.33395314243214 | 1.92 | 3.44 | -1.3 | 4.28 |
| 93.50130159910749 | 1.94 | 3.48 | -1.38 | 4.34 |
| 93.66865005578283 | 1.9 | 3.54 | -1.47 | 4.41 |
| 93.83599851245818 | 1.83 | 3.61 | -1.55 | 4.49 |
| 94.00334696913353 | 1.81 | 3.66 | -1.63 | 4.56 |
| 94.17069542580886 | 1.9 | 3.67 | -1.69 | 4.62 |
| 94.3380438824842 | 2.02 | 3.7 | -1.72 | 4.71 |
| 94.50539233915954 | 2.14 | 3.72 | -1.75 | 4.79 |
| 94.66344365935292 | 2.18 | 3.78 | -1.81 | 4.88 |
| 94.83079211602828 | 2.14 | 3.85 | -1.86 | 4.94 |
| 94.99814057270362 | 2.11 | 3.91 | -1.93 | 5 |
| 95.16548902937897 | 2.08 | 3.97 | -1.97 | 5.03 |
| 95.33283748605432 | 2.06 | 4.01 | -2.01 | 5.06 |
| 95.50018594272963 | 2.04 | 4.04 | -2.04 | 5.08 |
| 95.66753439940499 | 1.96 | 4.11 | -2.09 | 5.13 |
| 95.83488285608034 | 1.8 | 4.19 | -2.14 | 5.18 |
| 96.00223131275567 | 1.62 | 4.29 | -2.2 | 5.24 |
| 96.16957976943102 | 1.43 | 4.39 | -2.26 | 5.3 |
| 96.33692822610638 | 1.2 | 4.49 | -2.32 | 5.37 |
| 96.50427668278171 | 0.95 | 4.58 | -2.38 | 5.45 |
| 96.67162513945706 | 0.68 | 4.68 | -2.43 | 5.51 |
| 96.8389735961324 | 0.4 | 4.75 | -2.48 | 5.59 |
| 96.99702491632577 | 0.11 | 4.81 | -2.51 | 5.68 |
| 97.16437337300111 | -0.15 | 4.85 | -2.53 | 5.74 |
| 97.33172182967647 | -0.39 | 4.88 | -2.54 | 5.79 |
| 97.49907028635181 | -0.56 | 4.91 | -2.54 | 5.82 |
| 97.66641874302715 | -0.51 | 4.92 | -2.51 | 5.8 |
| 97.8337671997025 | -0.47 | 4.93 | -2.49 | 5.78 |
| 98.00111565637785 | -0.41 | 4.95 | -2.48 | 5.75 |
| 98.16846411305319 | -0.34 | 4.96 | -2.46 | 5.73 |
| 98.33581256972855 | -0.35 | 4.96 | -2.45 | 5.71 |
| 98.50316102640389 | -0.29 | 4.96 | -2.44 | 5.69 |
| 98.67050948307921 | -0.25 | 4.95 | -2.44 | 5.67 |
| 98.83785793975456 | -0.2 | 4.94 | -2.44 | 5.65 |
| 99.0052063964299 | -0.14 | 4.92 | -2.41 | 5.63 |
| 99.17255485310525 | -0.03 | 4.89 | -2.37 | 5.58 |
| 99.33060617329863 | 0.1 | 4.85 | -2.31 | 5.53 |
| 99.49795462997399 | 0.19 | 4.81 | -2.27 | 5.49 |
| 99.66530308664933 | 0.24 | 4.78 | -2.23 | 5.46 |
| 99.83265154332467 | 0.27 | 4.75 | -2.2 | 5.42 |
| 100.0 | 0.3 | 4.72 | -2.17 | 5.39 |